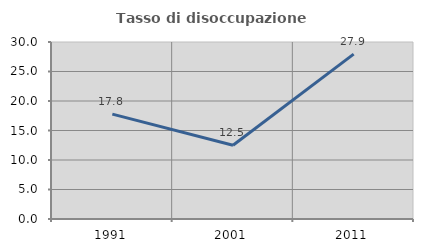
| Category | Tasso di disoccupazione giovanile  |
|---|---|
| 1991.0 | 17.778 |
| 2001.0 | 12.5 |
| 2011.0 | 27.941 |